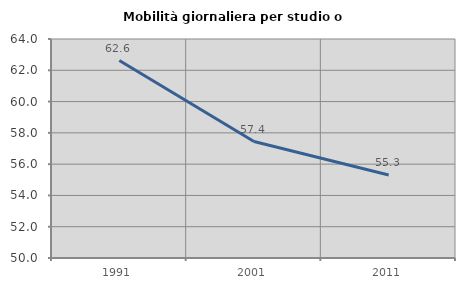
| Category | Mobilità giornaliera per studio o lavoro |
|---|---|
| 1991.0 | 62.624 |
| 2001.0 | 57.447 |
| 2011.0 | 55.31 |